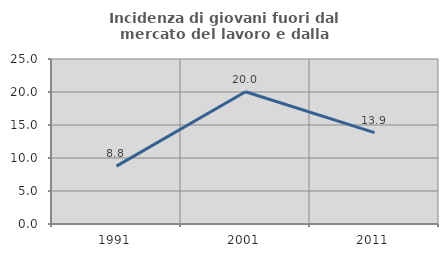
| Category | Incidenza di giovani fuori dal mercato del lavoro e dalla formazione  |
|---|---|
| 1991.0 | 8.763 |
| 2001.0 | 20.033 |
| 2011.0 | 13.853 |